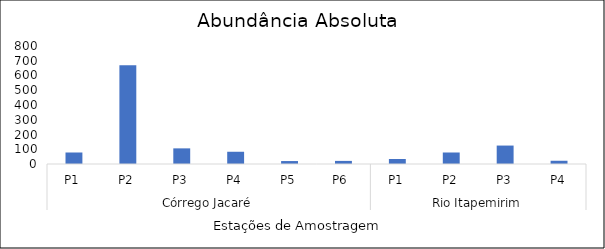
| Category | Series 0 |
|---|---|
| 0 | 78 |
| 1 | 670 |
| 2 | 106 |
| 3 | 83 |
| 4 | 20 |
| 5 | 21 |
| 6 | 34 |
| 7 | 78 |
| 8 | 125 |
| 9 | 22 |